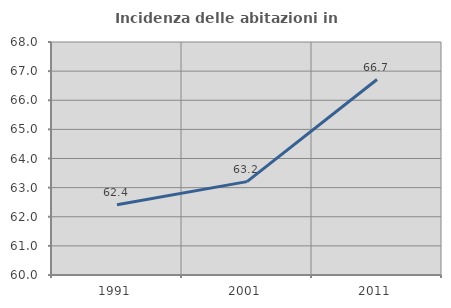
| Category | Incidenza delle abitazioni in proprietà  |
|---|---|
| 1991.0 | 62.409 |
| 2001.0 | 63.206 |
| 2011.0 | 66.711 |